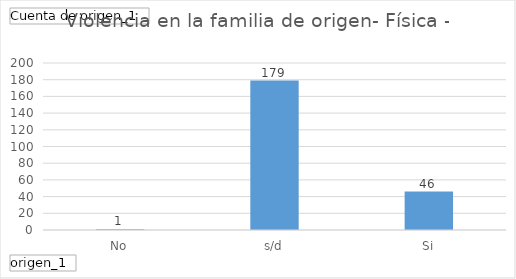
| Category | Total |
|---|---|
| No | 1 |
| s/d | 179 |
| Si | 46 |